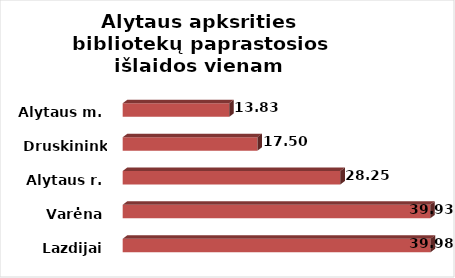
| Category | Series 0 |
|---|---|
| Lazdijai | 39.983 |
| Varėna | 39.929 |
| Alytaus r. | 28.254 |
| Druskininkai | 17.498 |
| Alytaus m. | 13.834 |